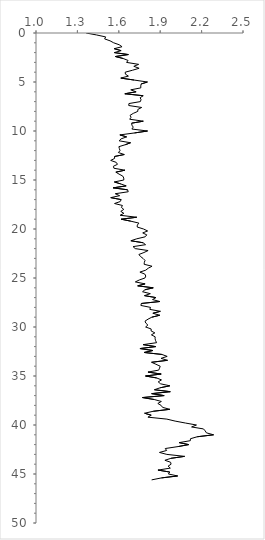
| Category | Series 0 |
|---|---|
| 1.3632 | 0 |
| 1.4391 | 0.2 |
| 1.5049 | 0.4 |
| 1.4973 | 0.6 |
| 1.5367 | 0.8 |
| 1.563 | 1 |
| 1.603 | 1.2 |
| 1.6235 | 1.4 |
| 1.5665 | 1.6 |
| 1.6168 | 1.8 |
| 1.5677 | 2 |
| 1.6692 | 2.2 |
| 1.5751 | 2.4 |
| 1.6311 | 2.6 |
| 1.6672 | 2.8 |
| 1.6563 | 3 |
| 1.7438 | 3.2 |
| 1.7087 | 3.4 |
| 1.7471 | 3.6 |
| 1.6993 | 3.8 |
| 1.6463 | 4 |
| 1.6479 | 4.2 |
| 1.6696 | 4.4 |
| 1.6144 | 4.6 |
| 1.7107 | 4.8 |
| 1.8076 | 5 |
| 1.7621 | 5.2 |
| 1.7592 | 5.4 |
| 1.7596 | 5.6 |
| 1.6866 | 5.8 |
| 1.7255 | 6 |
| 1.6439 | 6.2 |
| 1.7767 | 6.4 |
| 1.7546 | 6.6 |
| 1.7612 | 6.8 |
| 1.7562 | 7 |
| 1.6733 | 7.2 |
| 1.672 | 7.4 |
| 1.7658 | 7.6 |
| 1.7379 | 7.8 |
| 1.7375 | 8 |
| 1.705 | 8.2 |
| 1.6818 | 8.4 |
| 1.6887 | 8.6 |
| 1.6793 | 8.8 |
| 1.7776 | 9 |
| 1.6932 | 9.2 |
| 1.6948 | 9.4 |
| 1.7046 | 9.6 |
| 1.6948 | 9.8 |
| 1.8084 | 10 |
| 1.7132 | 10.2 |
| 1.6077 | 10.4 |
| 1.6567 | 10.6 |
| 1.6168 | 10.8 |
| 1.6022 | 11 |
| 1.6854 | 11.2 |
| 1.6467 | 11.4 |
| 1.6006 | 11.6 |
| 1.6041 | 11.8 |
| 1.6089 | 12 |
| 1.597 | 12.2 |
| 1.6399 | 12.4 |
| 1.5692 | 12.6 |
| 1.5696 | 12.8 |
| 1.5413 | 13 |
| 1.5813 | 13.2 |
| 1.5904 | 13.4 |
| 1.5607 | 13.6 |
| 1.5646 | 13.8 |
| 1.6443 | 14 |
| 1.5786 | 14.2 |
| 1.6018 | 14.4 |
| 1.6287 | 14.6 |
| 1.6359 | 14.8 |
| 1.6363 | 15 |
| 1.5677 | 15.2 |
| 1.614 | 15.4 |
| 1.6535 | 15.6 |
| 1.5591 | 15.8 |
| 1.6636 | 16 |
| 1.6684 | 16.2 |
| 1.5743 | 16.4 |
| 1.6061 | 16.6 |
| 1.5417 | 16.8 |
| 1.6172 | 17 |
| 1.6101 | 17.2 |
| 1.5692 | 17.4 |
| 1.6263 | 17.6 |
| 1.6188 | 17.8 |
| 1.6363 | 18 |
| 1.6144 | 18.2 |
| 1.6367 | 18.4 |
| 1.6097 | 18.6 |
| 1.7301 | 18.8 |
| 1.6176 | 19 |
| 1.6866 | 19.2 |
| 1.7458 | 19.4 |
| 1.7342 | 19.6 |
| 1.7334 | 19.8 |
| 1.7793 | 20 |
| 1.8089 | 20.2 |
| 1.7734 | 20.4 |
| 1.8029 | 20.6 |
| 1.7906 | 20.8 |
| 1.7301 | 21 |
| 1.6875 | 21.2 |
| 1.7759 | 21.4 |
| 1.794 | 21.6 |
| 1.7034 | 21.8 |
| 1.719 | 22 |
| 1.8123 | 22.2 |
| 1.7822 | 22.4 |
| 1.7458 | 22.6 |
| 1.7567 | 22.8 |
| 1.7755 | 23 |
| 1.7898 | 23.2 |
| 1.7852 | 23.4 |
| 1.7835 | 23.6 |
| 1.8409 | 23.8 |
| 1.8135 | 24 |
| 1.7953 | 24.2 |
| 1.7529 | 24.4 |
| 1.7885 | 24.6 |
| 1.7957 | 24.8 |
| 1.7894 | 25 |
| 1.7487 | 25.2 |
| 1.7198 | 25.4 |
| 1.7906 | 25.6 |
| 1.7371 | 25.8 |
| 1.8495 | 26 |
| 1.7894 | 26.2 |
| 1.7721 | 26.4 |
| 1.8285 | 26.6 |
| 1.786 | 26.8 |
| 1.869 | 27 |
| 1.8444 | 27.2 |
| 1.8974 | 27.4 |
| 1.7633 | 27.6 |
| 1.76 | 27.8 |
| 1.8302 | 28 |
| 1.8246 | 28.2 |
| 1.9013 | 28.4 |
| 1.8469 | 28.6 |
| 1.8969 | 28.8 |
| 1.8392 | 29 |
| 1.8118 | 29.2 |
| 1.7902 | 29.4 |
| 1.7953 | 29.6 |
| 1.8106 | 29.8 |
| 1.7944 | 30 |
| 1.8345 | 30.2 |
| 1.834 | 30.4 |
| 1.8612 | 30.6 |
| 1.8362 | 30.8 |
| 1.8634 | 31 |
| 1.8629 | 31.2 |
| 1.8668 | 31.4 |
| 1.8742 | 31.6 |
| 1.7763 | 31.8 |
| 1.8673 | 32 |
| 1.7533 | 32.2 |
| 1.8469 | 32.4 |
| 1.7831 | 32.6 |
| 1.9123 | 32.8 |
| 1.9506 | 33 |
| 1.9062 | 33.2 |
| 1.9532 | 33.4 |
| 1.8375 | 33.6 |
| 1.8686 | 33.8 |
| 1.9 | 34 |
| 1.8952 | 34.2 |
| 1.8891 | 34.4 |
| 1.8114 | 34.6 |
| 1.9071 | 34.8 |
| 1.7936 | 35 |
| 1.8747 | 35.2 |
| 1.9093 | 35.4 |
| 1.8856 | 35.6 |
| 1.9031 | 35.8 |
| 1.9699 | 36 |
| 1.9 | 36.2 |
| 1.8582 | 36.4 |
| 1.973 | 36.6 |
| 1.8383 | 36.8 |
| 1.9287 | 37 |
| 1.7713 | 37.2 |
| 1.8573 | 37.4 |
| 1.9084 | 37.6 |
| 1.8829 | 37.8 |
| 1.9066 | 38 |
| 1.9172 | 38.2 |
| 1.9699 | 38.4 |
| 1.8495 | 38.6 |
| 1.7868 | 38.8 |
| 1.8349 | 39 |
| 1.811 | 39.2 |
| 1.9483 | 39.4 |
| 2.008 | 39.6 |
| 2.083 | 39.8 |
| 2.1629 | 40 |
| 2.1274 | 40.2 |
| 2.2136 | 40.4 |
| 2.226 | 40.6 |
| 2.2349 | 40.8 |
| 2.2869 | 41 |
| 2.1683 | 41.2 |
| 2.1193 | 41.4 |
| 2.1184 | 41.6 |
| 2.0373 | 41.8 |
| 2.1065 | 42 |
| 2.0304 | 42.2 |
| 1.9367 | 42.4 |
| 1.9465 | 42.6 |
| 1.8948 | 42.8 |
| 1.9483 | 43 |
| 2.0769 | 43.2 |
| 1.978 | 43.4 |
| 1.9341 | 43.6 |
| 1.9753 | 43.8 |
| 1.9789 | 44 |
| 1.9573 | 44.2 |
| 1.9735 | 44.4 |
| 1.8838 | 44.6 |
| 1.9694 | 44.8 |
| 1.9595 | 45 |
| 2.0267 | 45.2 |
| 1.9088 | 45.4 |
| 1.8379 | 45.6 |